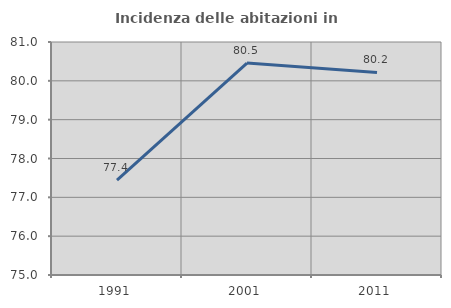
| Category | Incidenza delle abitazioni in proprietà  |
|---|---|
| 1991.0 | 77.445 |
| 2001.0 | 80.458 |
| 2011.0 | 80.215 |